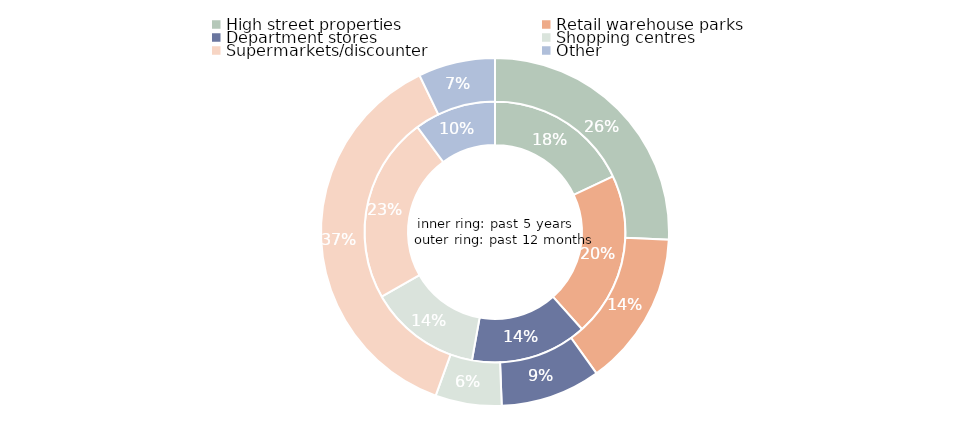
| Category | Series 1 | Series 0 |
|---|---|---|
| High street properties | 1721379898.878 | 1430377418 |
| Retail warehouse parks | 1950312670.8 | 799733195 |
| Department stores | 1382762996.952 | 517010584.99 |
| Shopping centres | 1331977115.586 | 342270223 |
| Supermarkets/discounter | 2211621374.948 | 2075863472.3 |
| Other | 968976970.662 | 397532014 |